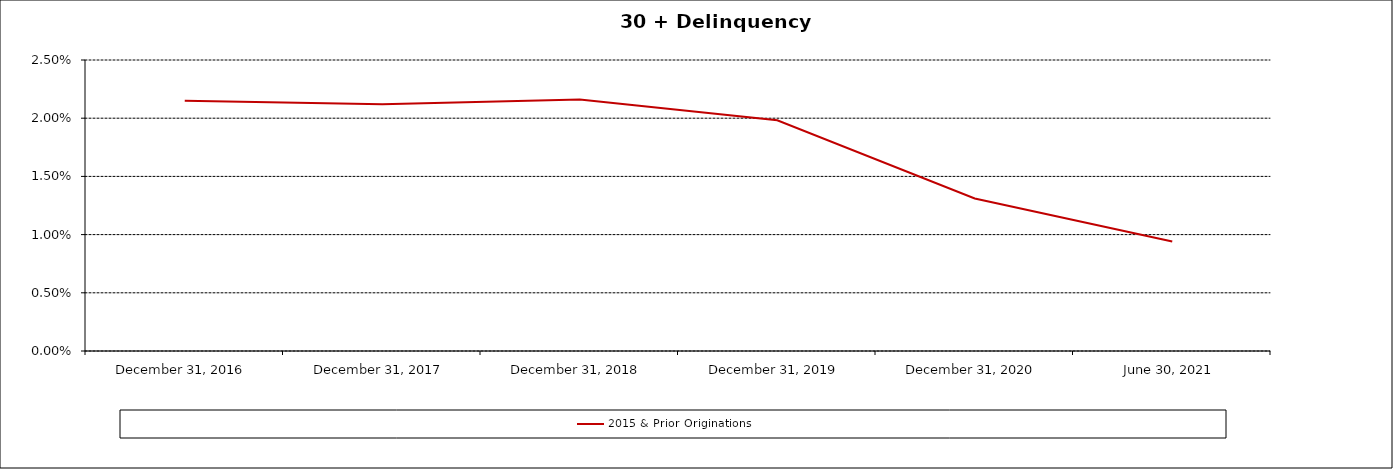
| Category | 2015 & Prior Originations |
|---|---|
| 2016-12-31 | 0.022 |
| 2017-12-31 | 0.021 |
| 2018-12-31 | 0.022 |
| 2019-12-31 | 0.02 |
| 2020-12-31 | 0.013 |
| 2021-06-30 | 0.009 |